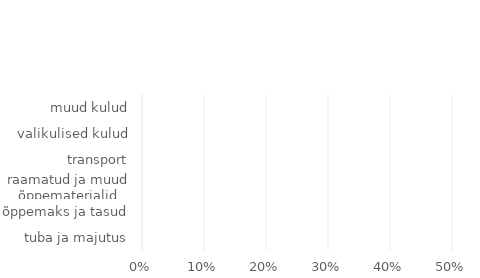
| Category | Series 0 |
|---|---|
| tuba ja majutus | 0 |
| õppemaks ja tasud | 0 |
| raamatud ja muud õppematerjalid | 0 |
| transport | 0 |
| valikulised kulud | 0 |
| muud kulud | 0 |